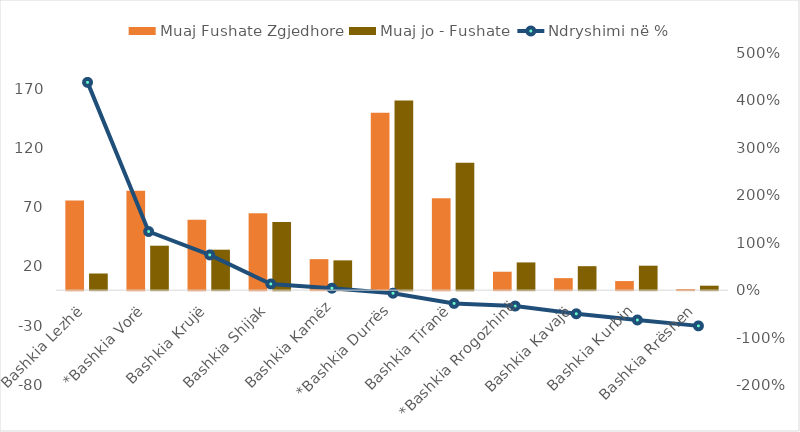
| Category | Muaj Fushate Zgjedhore | Muaj jo - Fushate |
|---|---|---|
| Bashkia Lezhë | 75.522 | 14.036 |
| *Bashkia Vorë | 83.794 | 37.476 |
| Bashkia Krujë | 59.441 | 34.107 |
| Bashkia Shijak | 64.91 | 57.422 |
| Bashkia Kamëz | 26.14 | 25.112 |
| *Bashkia Durrës | 149.578 | 159.885 |
| Bashkia Tiranë | 77.421 | 107.494 |
| *Bashkia Rrogozhinë | 15.533 | 23.376 |
| Bashkia Kavajë | 10.134 | 20.207 |
| Bashkia Kurbin | 7.651 | 20.618 |
| Bashkia Rrëshen | 0.924 | 3.751 |